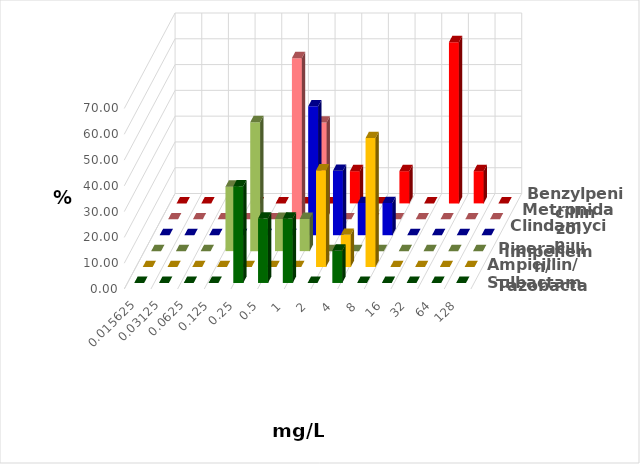
| Category | Ampicillin/ Sulbactam | Piperacillin/ Tazobactam | Imipenem | Clindamycin | Metronidazol | Benzylpenicillin |
|---|---|---|---|---|---|---|
| 0.015625 | 0 | 0 | 0 | 0 | 0 | 0 |
| 0.03125 | 0 | 0 | 0 | 0 | 0 | 0 |
| 0.0625 | 0 | 0 | 0 | 0 | 0 | 0 |
| 0.125 | 0 | 0 | 25 | 0 | 0 | 0 |
| 0.25 | 37.5 | 0 | 50 | 0 | 0 | 0 |
| 0.5 | 25 | 0 | 12.5 | 0 | 62.5 | 0 |
| 1.0 | 25 | 0 | 12.5 | 50 | 37.5 | 0 |
| 2.0 | 0 | 37.5 | 0 | 25 | 0 | 12.5 |
| 4.0 | 12.5 | 12.5 | 0 | 12.5 | 0 | 0 |
| 8.0 | 0 | 50 | 0 | 12.5 | 0 | 12.5 |
| 16.0 | 0 | 0 | 0 | 0 | 0 | 0 |
| 32.0 | 0 | 0 | 0 | 0 | 0 | 62.5 |
| 64.0 | 0 | 0 | 0 | 0 | 0 | 12.5 |
| 128.0 | 0 | 0 | 0 | 0 | 0 | 0 |